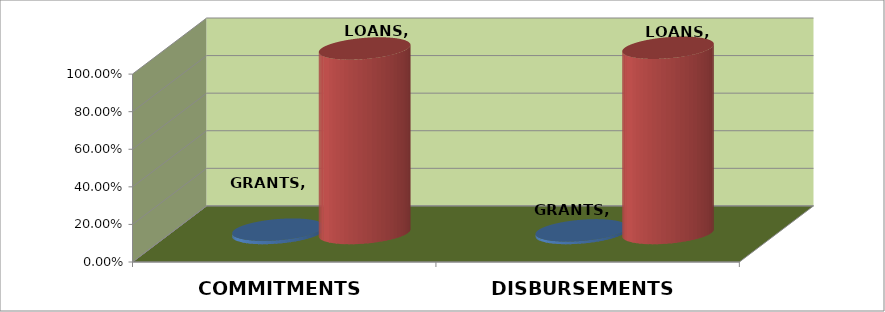
| Category | GRANTS | LOANS |
|---|---|---|
| COMMITMENTS | 0.018 | 0.982 |
| DISBURSEMENTS | 0.014 | 0.986 |